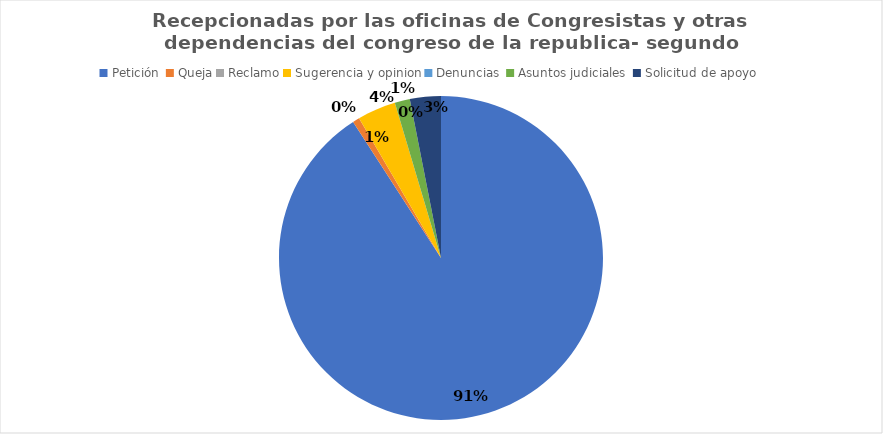
| Category | Series 0 |
|---|---|
| Petición  | 1324 |
| Queja | 10 |
| Reclamo | 0 |
| Sugerencia y opinion | 56 |
| Denuncias  | 0 |
| Asuntos judiciales  | 22 |
| Solicitud de apoyo | 45 |